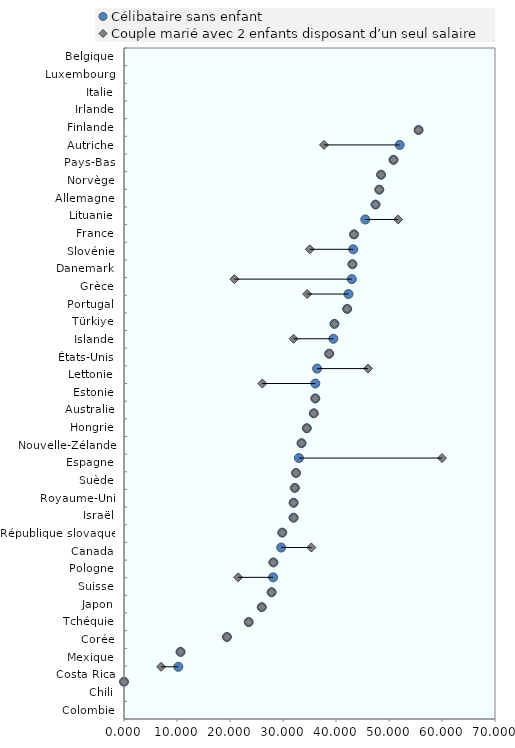
| Category | blankName |
|---|---|
| Colombie | 0 |
| Chili | 7 |
| Costa Rica | 10.67 |
| Mexique | 19.423 |
| Corée | 23.523 |
| Tchéquie | 26 |
| Japon | 27.857 |
| Suisse | 21.538 |
| Pologne | 28.181 |
| Canada | 35.35 |
| République slovaque | 29.854 |
| Israël | 32 |
| Royaume-Uni | 32 |
| Suède | 32.24 |
| Espagne | 32.457 |
| Nouvelle-Zélande | 60 |
| Hongrie | 33.5 |
| Australie | 34.5 |
| Estonie | 35.813 |
| Lettonie | 36.092 |
| États-Unis | 26.1 |
| Islande | 46.032 |
| Türkiye | 38.709 |
| Portugal | 32 |
| Grèce | 39.709 |
| Danemark | 42.112 |
| Slovénie | 34.564 |
| France | 20.84 |
| Lituanie | 43.1 |
| Allemagne | 35.056 |
| Norvège | 43.4 |
| Pays-Bas | 51.726 |
| Autriche | 47.463 |
| Finlande | 48.164 |
| Irlande | 48.5 |
| Italie | 50.852 |
| Luxembourg | 37.745 |
| Belgique | 55.575 |